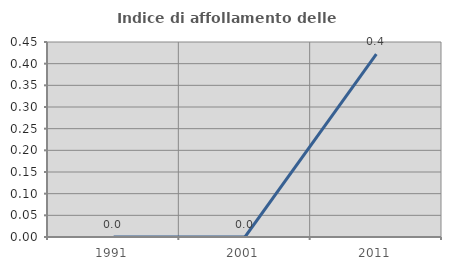
| Category | Indice di affollamento delle abitazioni  |
|---|---|
| 1991.0 | 0 |
| 2001.0 | 0 |
| 2011.0 | 0.422 |